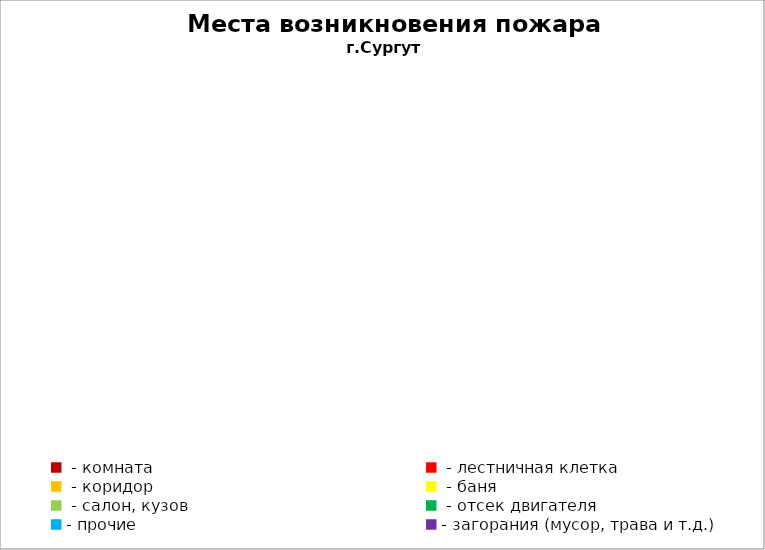
| Category | Места возникновения пожара |
|---|---|
|  - комната | 65 |
|  - лестничная клетка | 30 |
|  - коридор | 4 |
|  - баня | 52 |
|  - салон, кузов | 26 |
|  - отсек двигателя | 28 |
| - прочие | 107 |
| - загорания (мусор, трава и т.д.)  | 175 |